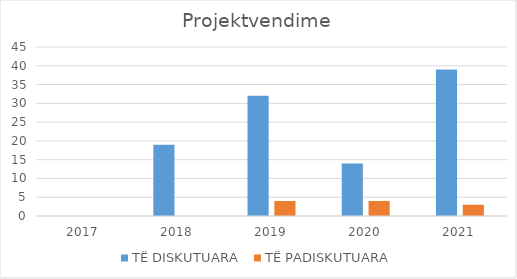
| Category | TË DISKUTUARA  | TË PADISKUTUARA |
|---|---|---|
| 2017.0 | 0 | 0 |
| 2018.0 | 19 | 0 |
| 2019.0 | 32 | 4 |
| 2020.0 | 14 | 4 |
| 2021.0 | 39 | 3 |